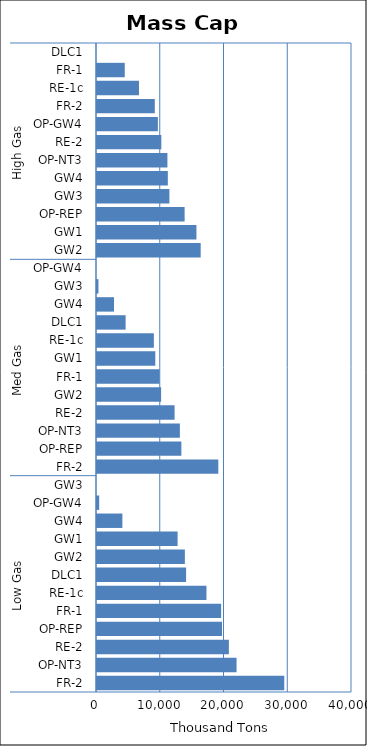
| Category | Mass Cap B |
|---|---|
| 0 | 29377.33 |
| 1 | 21892.31 |
| 2 | 20688.11 |
| 3 | 19608.43 |
| 4 | 19473.58 |
| 5 | 17171.09 |
| 6 | 13976.18 |
| 7 | 13782.33 |
| 8 | 12642.85 |
| 9 | 3981.22 |
| 10 | 340.64 |
| 11 | 0 |
| 12 | 19028.53 |
| 13 | 13234.04 |
| 14 | 13000.75 |
| 15 | 12168.72 |
| 16 | 10056.36 |
| 17 | 9807.72 |
| 18 | 9143.88 |
| 19 | 8920.63 |
| 20 | 4489.38 |
| 21 | 2669.7 |
| 22 | 224.69 |
| 23 | 0 |
| 24 | 16264.53 |
| 25 | 15598.25 |
| 26 | 13745.69 |
| 27 | 11357.8 |
| 28 | 11109.88 |
| 29 | 11045.3 |
| 30 | 10091.2 |
| 31 | 9548.91 |
| 32 | 9066.69 |
| 33 | 6587.76 |
| 34 | 4353.74 |
| 35 | 0 |